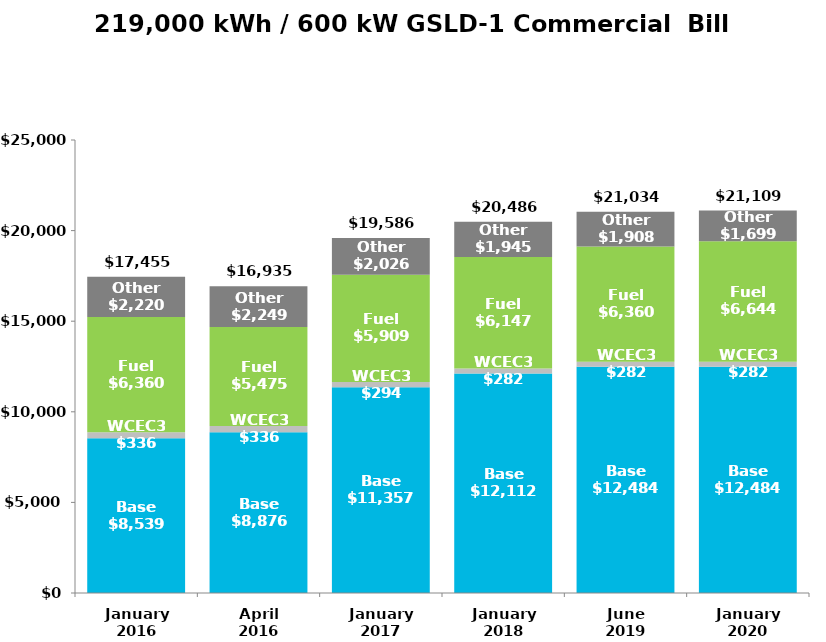
| Category | Base | WCEC3 | Fuel | Other |
|---|---|---|---|---|
| January
2016 | 8538.95 | 336 | 6359.76 | 2220.23 |
| April
2016 | 8875.53 | 336 | 5475 | 2248.85 |
| January
2017 | 11357.46 | 294 | 5908.62 | 2026.2 |
| January
2018 | 12112.26 | 282 | 6147.33 | 1944.9 |
| June
2019 | 12483.72 | 282 | 6359.76 | 1908.4 |
| January
2020 | 12483.72 | 282 | 6644.46 | 1698.5 |